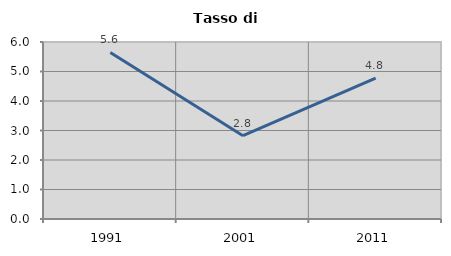
| Category | Tasso di disoccupazione   |
|---|---|
| 1991.0 | 5.647 |
| 2001.0 | 2.823 |
| 2011.0 | 4.779 |